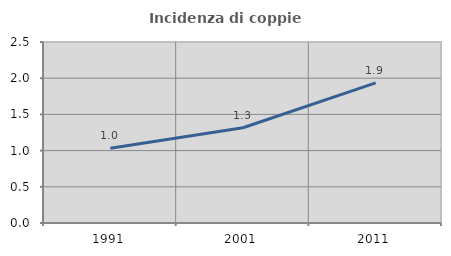
| Category | Incidenza di coppie miste |
|---|---|
| 1991.0 | 1.034 |
| 2001.0 | 1.316 |
| 2011.0 | 1.935 |